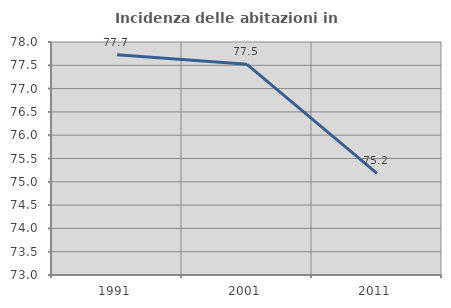
| Category | Incidenza delle abitazioni in proprietà  |
|---|---|
| 1991.0 | 77.729 |
| 2001.0 | 77.52 |
| 2011.0 | 75.181 |